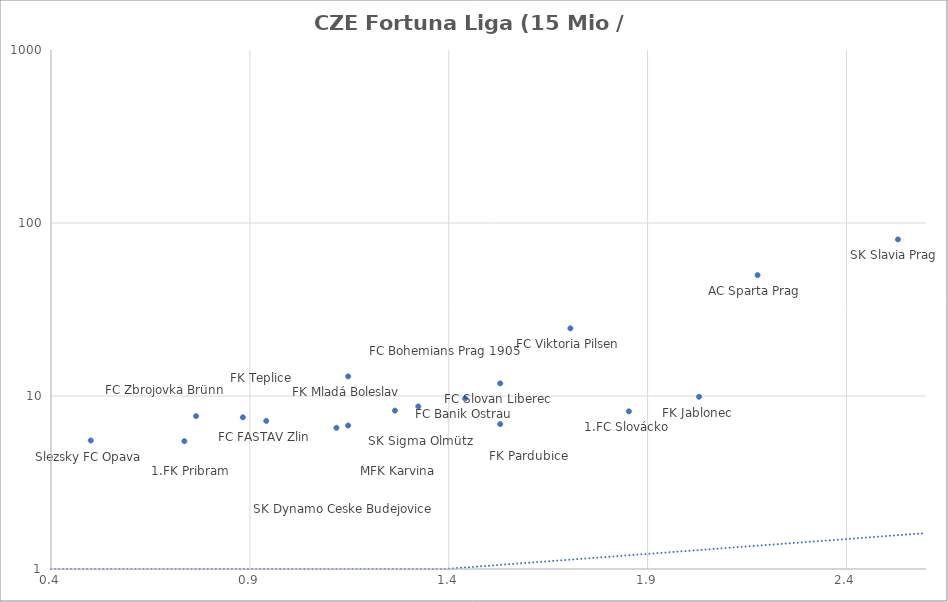
| Category | Series 0 |
|---|---|
| 2.5294117647058822 | 80.4 |
| 2.176470588235294 | 49.95 |
| 2.0294117647058822 | 9.9 |
| 1.8529411764705883 | 8.15 |
| 1.7058823529411764 | 24.6 |
| 1.5294117647058822 | 11.83 |
| 1.5294117647058822 | 6.88 |
| 1.4411764705882353 | 9.68 |
| 1.3235294117647058 | 8.7 |
| 1.2647058823529411 | 8.23 |
| 1.1470588235294117 | 12.98 |
| 1.1470588235294117 | 6.75 |
| 1.1176470588235294 | 6.55 |
| 0.9411764705882353 | 7.18 |
| 0.8823529411764706 | 7.53 |
| 0.7647058823529411 | 7.65 |
| 0.7352941176470589 | 5.48 |
| 0.5 | 5.53 |